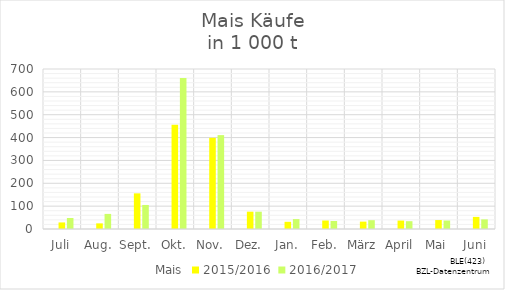
| Category | Mais | 2015/2016 | 2016/2017 |
|---|---|---|---|
| Juli |  | 28.741 | 48.205 |
| Aug. |  | 24.607 | 66.07 |
| Sept. |  | 155.967 | 105.141 |
| Okt. |  | 455.945 | 660.619 |
| Nov. |  | 399.024 | 410.749 |
| Dez. |  | 75.786 | 75.69 |
| Jan. |  | 31.504 | 43.262 |
| Feb. |  | 37.058 | 34.97 |
| März |  | 32.281 | 38.52 |
| April |  | 36.808 | 34.154 |
| Mai |  | 39.102 | 37.046 |
| Juni |  | 52.965 | 42.118 |